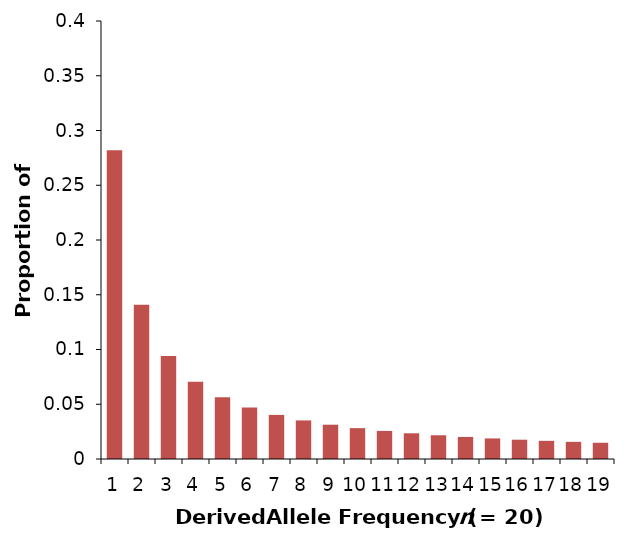
| Category | Series 1 |
|---|---|
| 0 | 0.282 |
| 1 | 0.141 |
| 2 | 0.094 |
| 3 | 0.07 |
| 4 | 0.056 |
| 5 | 0.047 |
| 6 | 0.04 |
| 7 | 0.035 |
| 8 | 0.031 |
| 9 | 0.028 |
| 10 | 0.026 |
| 11 | 0.023 |
| 12 | 0.022 |
| 13 | 0.02 |
| 14 | 0.019 |
| 15 | 0.018 |
| 16 | 0.017 |
| 17 | 0.016 |
| 18 | 0.015 |